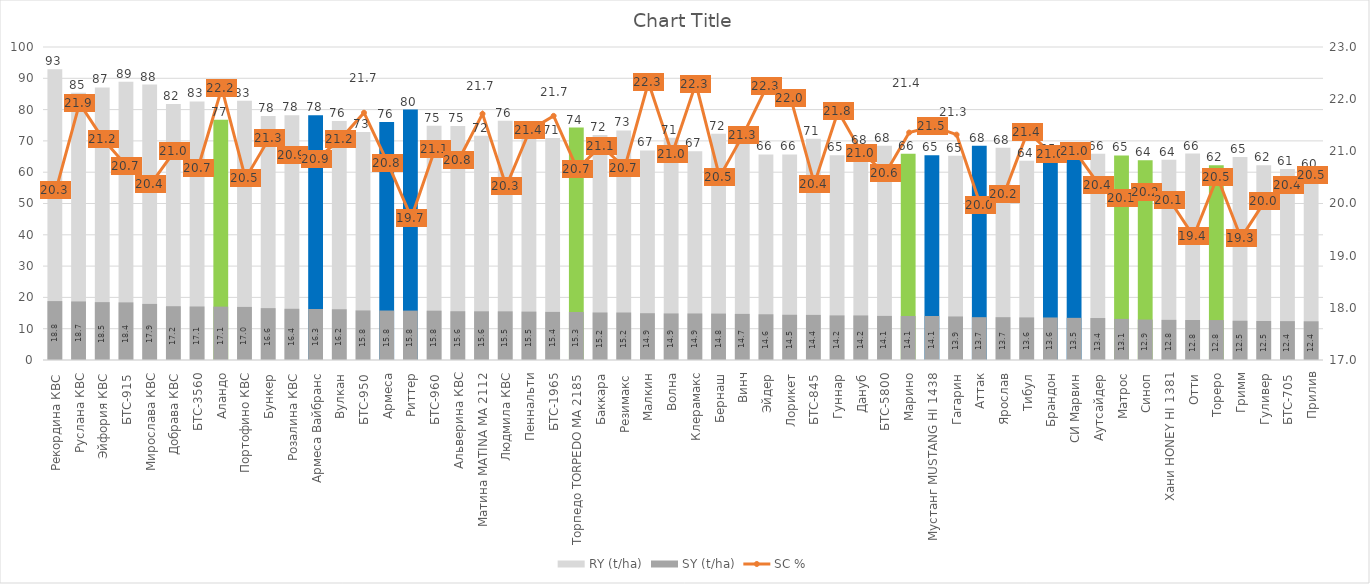
| Category | RY (t/ha) | SY (t/ha) |
|---|---|---|
| Рекордина КВС | 92.929 | 18.818 |
| Руслана КВС | 85.354 | 18.709 |
| Эйфория КВС | 87.071 | 18.485 |
| БТС-915 | 88.889 | 18.409 |
| Мирослава КВС | 87.98 | 17.921 |
| Добрава КВС | 81.818 | 17.182 |
| БТС-3560 | 82.626 | 17.095 |
| Аландо | 76.768 | 17.05 |
| Портофино КВС | 82.828 | 16.963 |
| Бункер | 77.98 | 16.571 |
| Розалина КВС | 78.182 | 16.363 |
| Армеса Вайбранс | 78.182 | 16.301 |
| Вулкан | 76.364 | 16.212 |
| БТС-950 | 72.828 | 15.833 |
| Армеса | 76.061 | 15.805 |
| Риттер | 80 | 15.784 |
| БТС-960 | 74.848 | 15.756 |
| Альверина КВС | 74.747 | 15.577 |
| Матина MATINA МА 2112 | 71.616 | 15.555 |
| Людмила КВС | 76.465 | 15.545 |
| Пеннальти | 72.222 | 15.463 |
| БТС-1965 | 70.909 | 15.373 |
| Торпедо TORPEDO MA 2185 | 74.242 | 15.338 |
| Баккара | 71.919 | 15.182 |
| Резимакс | 73.333 | 15.173 |
| Малкин | 66.97 | 14.948 |
| Волна | 71.01 | 14.877 |
| Клерамакс | 66.667 | 14.867 |
| Бернаш | 72.323 | 14.833 |
| Винч | 69.091 | 14.73 |
| Эйдер | 65.657 | 14.609 |
| Лорикет | 65.657 | 14.458 |
| БТС-845 | 70.707 | 14.41 |
| Гуннар | 65.455 | 14.249 |
| Дануб | 67.879 | 14.234 |
| БТС-5800 | 68.485 | 14.094 |
| Маринo | 65.859 | 14.067 |
| Мустанг MUSTANG HI 1438 | 65.455 | 14.06 |
| Гагарин | 65.253 | 13.912 |
| Аттак | 68.485 | 13.683 |
| Ярослав | 67.778 | 13.678 |
| Тибул | 63.636 | 13.605 |
| Брандон | 64.848 | 13.586 |
| СИ Марвин | 64.141 | 13.47 |
| Аутсайдер | 65.859 | 13.409 |
| Матрос | 65.354 | 13.136 |
| Синоп | 63.838 | 12.915 |
| Хани HONEY HI 1381 | 63.939 | 12.826 |
| Отти | 65.96 | 12.776 |
| Тореро | 62.222 | 12.762 |
| Гримм | 64.848 | 12.542 |
| Гуливер | 62.222 | 12.469 |
| БТС-705 | 61.01 | 12.416 |
| Прилив | 60.202 | 12.365 |